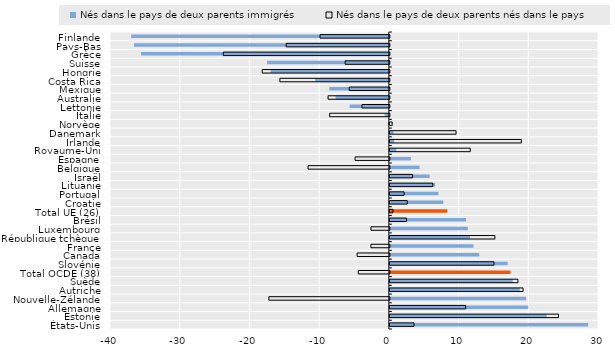
| Category | Nés dans le pays de deux parents immigrés | Nés dans le pays de deux parents nés dans le pays |
|---|---|---|
| Finlande | -36.955 | -9.951 |
| Pays-Bas | -36.559 | -14.803 |
| Grèce | -35.547 | -23.816 |
| Suisse | -17.472 | -6.342 |
| Hongrie | -16.952 | -18.233 |
| Costa Rica | -10.567 | -15.706 |
| Mexique | -8.555 | -5.748 |
| Australie | -7.647 | -8.794 |
| Lettonie | -5.625 | -3.919 |
| Italie | -0.594 | -8.563 |
| Norvège | -0.142 | 0.332 |
| Danemark | 0.514 | 9.495 |
| Irlande | 0.617 | 18.867 |
| Royaume-Uni | 0.933 | 11.533 |
| Espagne | 3.02 | -4.914 |
| Belgique | 4.27 | -11.664 |
| Israël | 5.707 | 3.262 |
| Lituanie | 6.497 | 6.163 |
| Portugal | 6.965 | 2.043 |
| Croatie | 7.659 | 2.492 |
| Total UE (26) | 8.233 | 0.441 |
| Brésil | 10.931 | 2.39 |
| Luxembourg | 11.185 | -2.64 |
| République tchèque | 11.503 | 15.062 |
| France | 11.995 | -2.648 |
| Canada | 12.822 | -4.623 |
| Slovénie | 16.89 | 14.932 |
| Total OCDE (38) | 17.305 | -4.455 |
| Suède | 17.622 | 18.374 |
| Autriche | 18.626 | 19.107 |
| Nouvelle-Zélande | 19.563 | -17.283 |
| Allemagne | 19.855 | 10.882 |
| Estonie | 22.499 | 24.19 |
| États-Unis | 28.438 | 3.465 |